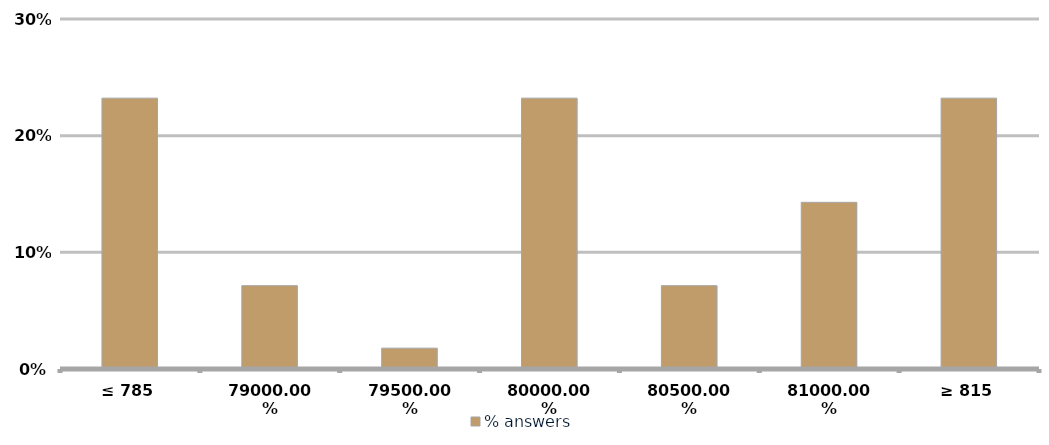
| Category | % answers |
|---|---|
| ≤ 785 | 0.232 |
| 790 | 0.071 |
| 795 | 0.018 |
| 800 | 0.232 |
| 805 | 0.071 |
| 810 | 0.143 |
| ≥ 815 | 0.232 |